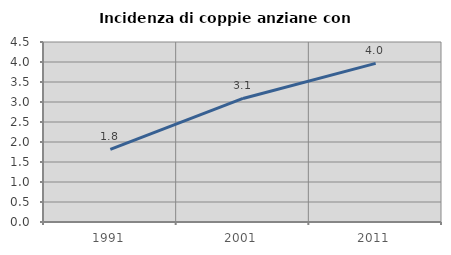
| Category | Incidenza di coppie anziane con figli |
|---|---|
| 1991.0 | 1.817 |
| 2001.0 | 3.089 |
| 2011.0 | 3.966 |